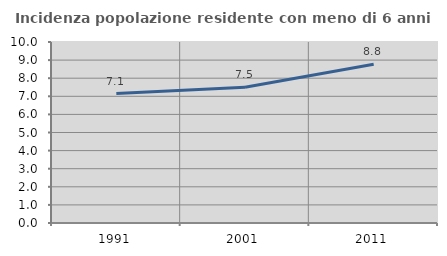
| Category | Incidenza popolazione residente con meno di 6 anni |
|---|---|
| 1991.0 | 7.149 |
| 2001.0 | 7.496 |
| 2011.0 | 8.771 |